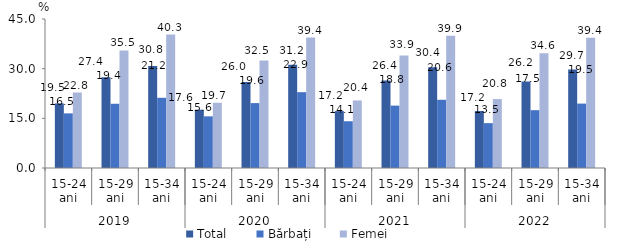
| Category | Total | Bărbați | Femei |
|---|---|---|---|
| 0 | 19.5 | 16.5 | 22.8 |
| 1 | 27.4 | 19.4 | 35.5 |
| 2 | 30.8 | 21.2 | 40.3 |
| 3 | 17.6 | 15.6 | 19.7 |
| 4 | 26 | 19.6 | 32.5 |
| 5 | 31.2 | 22.9 | 39.4 |
| 6 | 17.182 | 14.118 | 20.4 |
| 7 | 26.411 | 18.841 | 33.947 |
| 8 | 30.439 | 20.602 | 39.92 |
| 9 | 17.204 | 13.546 | 20.817 |
| 10 | 26.153 | 17.461 | 34.637 |
| 11 | 29.718 | 19.456 | 39.366 |